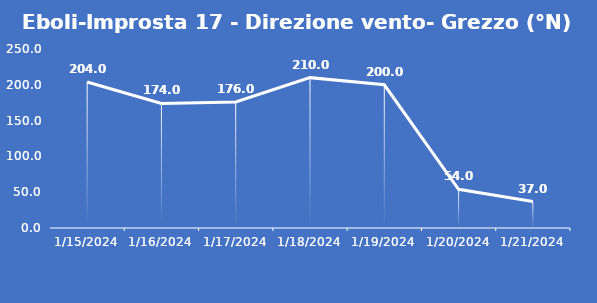
| Category | Eboli-Improsta 17 - Direzione vento- Grezzo (°N) |
|---|---|
| 1/15/24 | 204 |
| 1/16/24 | 174 |
| 1/17/24 | 176 |
| 1/18/24 | 210 |
| 1/19/24 | 200 |
| 1/20/24 | 54 |
| 1/21/24 | 37 |